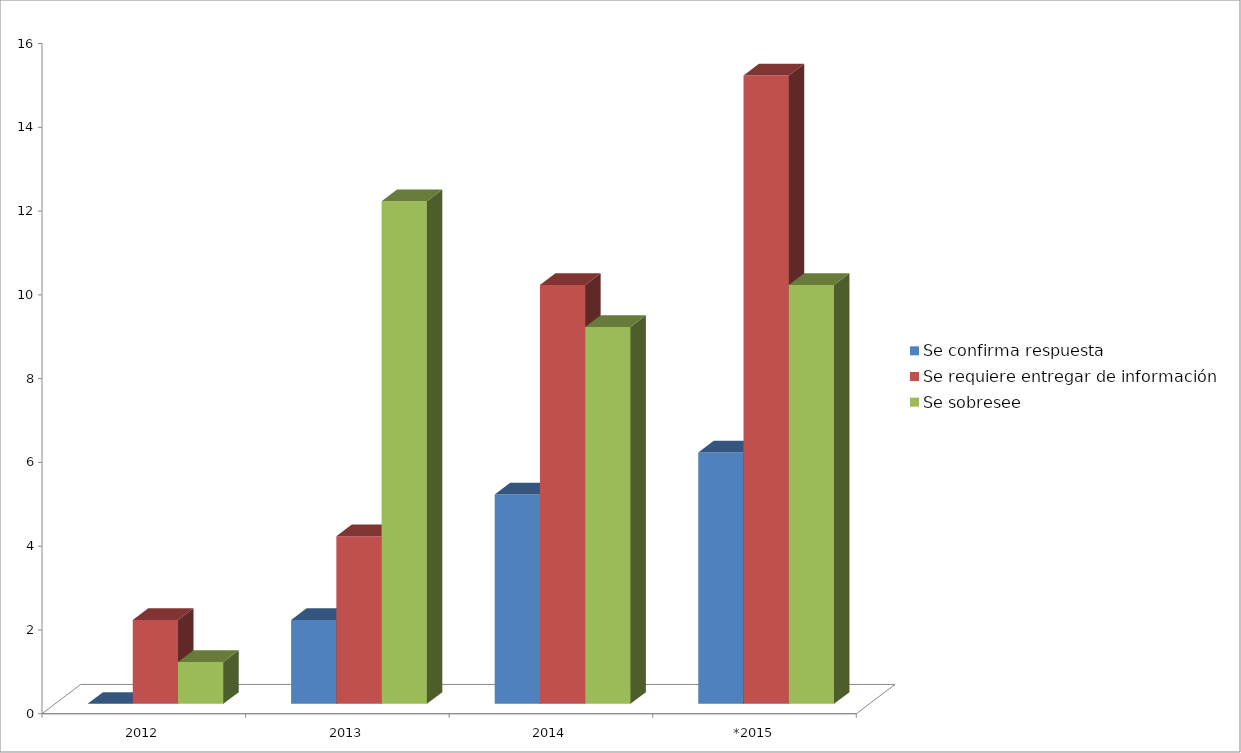
| Category | Se confirma respuesta | Se requiere entregar de información  | Se sobresee  |
|---|---|---|---|
| 2012 | 0 | 2 | 1 |
| 2013 | 2 | 4 | 12 |
| 2014 | 5 | 10 | 9 |
| *2015 | 6 | 15 | 10 |